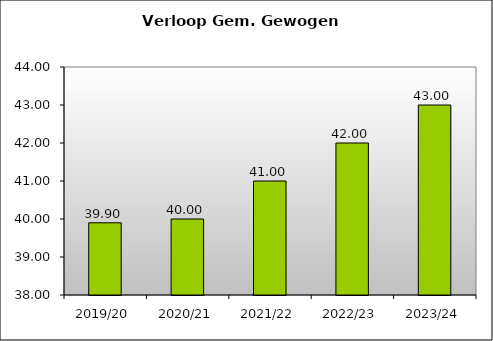
| Category | GGL |
|---|---|
| 2019/20 | 39.9 |
| 2020/21 | 40 |
| 2021/22 | 41 |
| 2022/23 | 42 |
| 2023/24 | 43 |